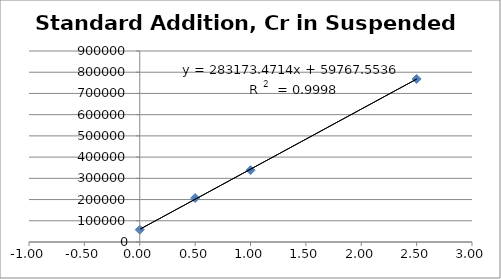
| Category | Series 0 |
|---|---|
| 0.0 | 57927.9 |
| 0.5 | 207161.4 |
| 1.0 | 338264.3 |
| 2.5 | 768410.5 |